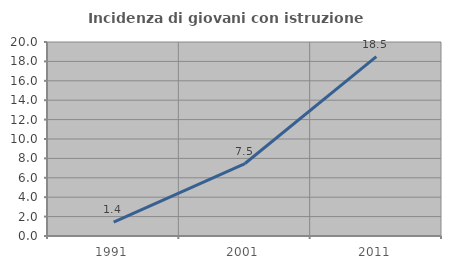
| Category | Incidenza di giovani con istruzione universitaria |
|---|---|
| 1991.0 | 1.418 |
| 2001.0 | 7.473 |
| 2011.0 | 18.493 |